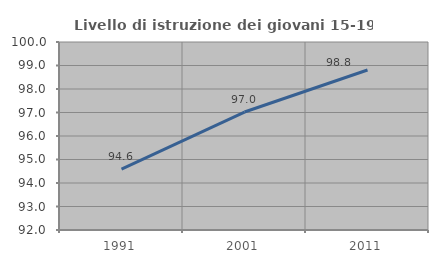
| Category | Livello di istruzione dei giovani 15-19 anni |
|---|---|
| 1991.0 | 94.59 |
| 2001.0 | 97.02 |
| 2011.0 | 98.81 |